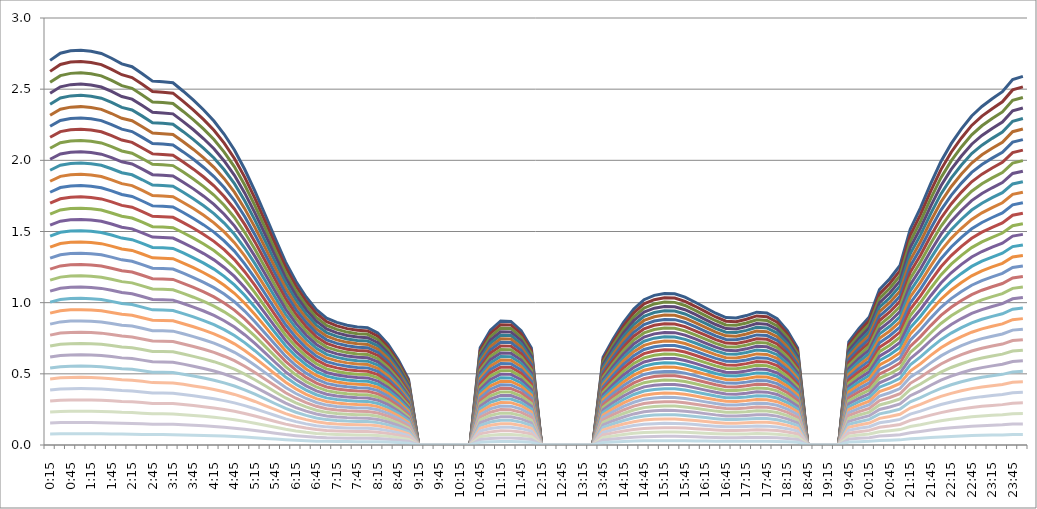
| Category | Series 0 | Series 1 | Series 2 | Series 3 | Series 4 | Series 5 | Series 6 | Series 7 | Series 8 | Series 9 | Series 10 | Series 11 | Series 12 | Series 13 | Series 14 | Series 15 | Series 16 | Series 17 | Series 18 | Series 19 | Series 20 | Series 21 | Series 22 | Series 23 | Series 24 | Series 25 | Series 26 | Series 27 | Series 28 | Series 29 | Series 30 | Series 31 | Series 32 | Series 33 | Series 34 |
|---|---|---|---|---|---|---|---|---|---|---|---|---|---|---|---|---|---|---|---|---|---|---|---|---|---|---|---|---|---|---|---|---|---|---|---|
| 0.010416666666666666 | 2.702 | 2.625 | 2.548 | 2.471 | 2.393 | 2.316 | 2.239 | 2.162 | 2.085 | 2.007 | 1.93 | 1.853 | 1.776 | 1.699 | 1.621 | 1.544 | 1.467 | 1.39 | 1.312 | 1.235 | 1.158 | 1.081 | 1.004 | 0.926 | 0.849 | 0.772 | 0.695 | 0.618 | 0.54 | 0.463 | 0.386 | 0.309 | 0.232 | 0.154 | 0.077 |
| 0.020833333333333332 | 2.752 | 2.674 | 2.595 | 2.516 | 2.438 | 2.359 | 2.28 | 2.202 | 2.123 | 2.045 | 1.966 | 1.887 | 1.809 | 1.73 | 1.651 | 1.573 | 1.494 | 1.415 | 1.337 | 1.258 | 1.18 | 1.101 | 1.022 | 0.944 | 0.865 | 0.786 | 0.708 | 0.629 | 0.55 | 0.472 | 0.393 | 0.315 | 0.236 | 0.157 | 0.079 |
| 0.03125 | 2.769 | 2.69 | 2.611 | 2.532 | 2.453 | 2.374 | 2.295 | 2.215 | 2.136 | 2.057 | 1.978 | 1.899 | 1.82 | 1.741 | 1.662 | 1.582 | 1.503 | 1.424 | 1.345 | 1.266 | 1.187 | 1.108 | 1.029 | 0.949 | 0.87 | 0.791 | 0.712 | 0.633 | 0.554 | 0.475 | 0.396 | 0.316 | 0.237 | 0.158 | 0.079 |
| 0.041666666666666664 | 2.774 | 2.694 | 2.615 | 2.536 | 2.457 | 2.377 | 2.298 | 2.219 | 2.14 | 2.06 | 1.981 | 1.902 | 1.823 | 1.743 | 1.664 | 1.585 | 1.506 | 1.426 | 1.347 | 1.268 | 1.189 | 1.109 | 1.03 | 0.951 | 0.872 | 0.792 | 0.713 | 0.634 | 0.555 | 0.475 | 0.396 | 0.317 | 0.238 | 0.158 | 0.079 |
| 0.05208333333333333 | 2.767 | 2.688 | 2.609 | 2.53 | 2.451 | 2.372 | 2.293 | 2.214 | 2.134 | 2.055 | 1.976 | 1.897 | 1.818 | 1.739 | 1.66 | 1.581 | 1.502 | 1.423 | 1.344 | 1.265 | 1.186 | 1.107 | 1.028 | 0.949 | 0.87 | 0.791 | 0.711 | 0.632 | 0.553 | 0.474 | 0.395 | 0.316 | 0.237 | 0.158 | 0.079 |
| 0.06249999999999999 | 2.751 | 2.672 | 2.594 | 2.515 | 2.436 | 2.358 | 2.279 | 2.201 | 2.122 | 2.043 | 1.965 | 1.886 | 1.808 | 1.729 | 1.65 | 1.572 | 1.493 | 1.415 | 1.336 | 1.258 | 1.179 | 1.1 | 1.022 | 0.943 | 0.865 | 0.786 | 0.707 | 0.629 | 0.55 | 0.472 | 0.393 | 0.314 | 0.236 | 0.157 | 0.079 |
| 0.07291666666666666 | 2.717 | 2.64 | 2.562 | 2.484 | 2.407 | 2.329 | 2.251 | 2.174 | 2.096 | 2.018 | 1.941 | 1.863 | 1.786 | 1.708 | 1.63 | 1.553 | 1.475 | 1.397 | 1.32 | 1.242 | 1.165 | 1.087 | 1.009 | 0.932 | 0.854 | 0.776 | 0.699 | 0.621 | 0.543 | 0.466 | 0.388 | 0.311 | 0.233 | 0.155 | 0.078 |
| 0.08333333333333333 | 2.678 | 2.602 | 2.525 | 2.449 | 2.372 | 2.295 | 2.219 | 2.142 | 2.066 | 1.989 | 1.913 | 1.836 | 1.76 | 1.683 | 1.607 | 1.53 | 1.454 | 1.377 | 1.301 | 1.224 | 1.148 | 1.071 | 0.995 | 0.918 | 0.842 | 0.765 | 0.689 | 0.612 | 0.536 | 0.459 | 0.383 | 0.306 | 0.23 | 0.153 | 0.077 |
| 0.09375 | 2.658 | 2.582 | 2.506 | 2.43 | 2.354 | 2.278 | 2.202 | 2.126 | 2.05 | 1.974 | 1.898 | 1.822 | 1.747 | 1.671 | 1.595 | 1.519 | 1.443 | 1.367 | 1.291 | 1.215 | 1.139 | 1.063 | 0.987 | 0.911 | 0.835 | 0.759 | 0.683 | 0.607 | 0.532 | 0.456 | 0.38 | 0.304 | 0.228 | 0.152 | 0.076 |
| 0.10416666666666667 | 2.609 | 2.534 | 2.46 | 2.385 | 2.311 | 2.236 | 2.162 | 2.087 | 2.012 | 1.938 | 1.863 | 1.789 | 1.714 | 1.64 | 1.565 | 1.491 | 1.416 | 1.342 | 1.267 | 1.193 | 1.118 | 1.044 | 0.969 | 0.894 | 0.82 | 0.745 | 0.671 | 0.596 | 0.522 | 0.447 | 0.373 | 0.298 | 0.224 | 0.149 | 0.075 |
| 0.11458333333333334 | 2.557 | 2.484 | 2.41 | 2.337 | 2.264 | 2.191 | 2.118 | 2.045 | 1.972 | 1.899 | 1.826 | 1.753 | 1.68 | 1.607 | 1.534 | 1.461 | 1.388 | 1.315 | 1.242 | 1.169 | 1.096 | 1.023 | 0.95 | 0.877 | 0.803 | 0.73 | 0.657 | 0.584 | 0.511 | 0.438 | 0.365 | 0.292 | 0.219 | 0.146 | 0.073 |
| 0.125 | 2.551 | 2.478 | 2.406 | 2.333 | 2.26 | 2.187 | 2.114 | 2.041 | 1.968 | 1.895 | 1.822 | 1.749 | 1.677 | 1.604 | 1.531 | 1.458 | 1.385 | 1.312 | 1.239 | 1.166 | 1.093 | 1.021 | 0.948 | 0.875 | 0.802 | 0.729 | 0.656 | 0.583 | 0.51 | 0.437 | 0.364 | 0.292 | 0.219 | 0.146 | 0.073 |
| 0.13541666666666666 | 2.545 | 2.472 | 2.399 | 2.327 | 2.254 | 2.181 | 2.108 | 2.036 | 1.963 | 1.89 | 1.818 | 1.745 | 1.672 | 1.599 | 1.527 | 1.454 | 1.381 | 1.309 | 1.236 | 1.163 | 1.091 | 1.018 | 0.945 | 0.872 | 0.8 | 0.727 | 0.654 | 0.582 | 0.509 | 0.436 | 0.364 | 0.291 | 0.218 | 0.145 | 0.073 |
| 0.14583333333333331 | 2.485 | 2.414 | 2.343 | 2.272 | 2.201 | 2.13 | 2.059 | 1.988 | 1.917 | 1.846 | 1.775 | 1.704 | 1.633 | 1.562 | 1.491 | 1.42 | 1.349 | 1.278 | 1.207 | 1.136 | 1.065 | 0.994 | 0.923 | 0.852 | 0.781 | 0.71 | 0.639 | 0.568 | 0.497 | 0.426 | 0.355 | 0.284 | 0.213 | 0.142 | 0.071 |
| 0.15624999999999997 | 2.422 | 2.353 | 2.284 | 2.215 | 2.146 | 2.076 | 2.007 | 1.938 | 1.869 | 1.8 | 1.73 | 1.661 | 1.592 | 1.523 | 1.453 | 1.384 | 1.315 | 1.246 | 1.177 | 1.107 | 1.038 | 0.969 | 0.9 | 0.831 | 0.761 | 0.692 | 0.623 | 0.554 | 0.484 | 0.415 | 0.346 | 0.277 | 0.208 | 0.138 | 0.069 |
| 0.16666666666666663 | 2.353 | 2.286 | 2.219 | 2.152 | 2.084 | 2.017 | 1.95 | 1.883 | 1.815 | 1.748 | 1.681 | 1.614 | 1.546 | 1.479 | 1.412 | 1.345 | 1.278 | 1.21 | 1.143 | 1.076 | 1.009 | 0.941 | 0.874 | 0.807 | 0.74 | 0.672 | 0.605 | 0.538 | 0.471 | 0.403 | 0.336 | 0.269 | 0.202 | 0.134 | 0.067 |
| 0.1770833333333333 | 2.276 | 2.211 | 2.146 | 2.081 | 2.016 | 1.951 | 1.886 | 1.821 | 1.756 | 1.691 | 1.626 | 1.561 | 1.496 | 1.431 | 1.366 | 1.301 | 1.236 | 1.171 | 1.106 | 1.041 | 0.976 | 0.911 | 0.846 | 0.78 | 0.715 | 0.65 | 0.585 | 0.52 | 0.455 | 0.39 | 0.325 | 0.26 | 0.195 | 0.13 | 0.065 |
| 0.18749999999999994 | 2.183 | 2.121 | 2.058 | 1.996 | 1.933 | 1.871 | 1.809 | 1.746 | 1.684 | 1.622 | 1.559 | 1.497 | 1.434 | 1.372 | 1.31 | 1.247 | 1.185 | 1.123 | 1.06 | 0.998 | 0.936 | 0.873 | 0.811 | 0.748 | 0.686 | 0.624 | 0.561 | 0.499 | 0.437 | 0.374 | 0.312 | 0.249 | 0.187 | 0.125 | 0.062 |
| 0.1979166666666666 | 2.073 | 2.014 | 1.954 | 1.895 | 1.836 | 1.777 | 1.717 | 1.658 | 1.599 | 1.54 | 1.481 | 1.421 | 1.362 | 1.303 | 1.244 | 1.184 | 1.125 | 1.066 | 1.007 | 0.948 | 0.888 | 0.829 | 0.77 | 0.711 | 0.651 | 0.592 | 0.533 | 0.474 | 0.415 | 0.355 | 0.296 | 0.237 | 0.178 | 0.118 | 0.059 |
| 0.20833333333333326 | 1.937 | 1.882 | 1.827 | 1.771 | 1.716 | 1.661 | 1.605 | 1.55 | 1.495 | 1.439 | 1.384 | 1.328 | 1.273 | 1.218 | 1.162 | 1.107 | 1.052 | 0.996 | 0.941 | 0.886 | 0.83 | 0.775 | 0.72 | 0.664 | 0.609 | 0.554 | 0.498 | 0.443 | 0.387 | 0.332 | 0.277 | 0.221 | 0.166 | 0.111 | 0.055 |
| 0.21874999999999992 | 1.784 | 1.733 | 1.682 | 1.631 | 1.58 | 1.529 | 1.478 | 1.427 | 1.376 | 1.325 | 1.274 | 1.223 | 1.172 | 1.121 | 1.07 | 1.019 | 0.968 | 0.917 | 0.866 | 0.815 | 0.764 | 0.713 | 0.663 | 0.612 | 0.561 | 0.51 | 0.459 | 0.408 | 0.357 | 0.306 | 0.255 | 0.204 | 0.153 | 0.102 | 0.051 |
| 0.22916666666666657 | 1.618 | 1.571 | 1.525 | 1.479 | 1.433 | 1.386 | 1.34 | 1.294 | 1.248 | 1.202 | 1.155 | 1.109 | 1.063 | 1.017 | 0.971 | 0.924 | 0.878 | 0.832 | 0.786 | 0.739 | 0.693 | 0.647 | 0.601 | 0.555 | 0.508 | 0.462 | 0.416 | 0.37 | 0.324 | 0.277 | 0.231 | 0.185 | 0.139 | 0.092 | 0.046 |
| 0.23958333333333323 | 1.449 | 1.408 | 1.366 | 1.325 | 1.283 | 1.242 | 1.201 | 1.159 | 1.118 | 1.076 | 1.035 | 0.994 | 0.952 | 0.911 | 0.869 | 0.828 | 0.787 | 0.745 | 0.704 | 0.662 | 0.621 | 0.58 | 0.538 | 0.497 | 0.455 | 0.414 | 0.373 | 0.331 | 0.29 | 0.248 | 0.207 | 0.166 | 0.124 | 0.083 | 0.041 |
| 0.2499999999999999 | 1.285 | 1.248 | 1.212 | 1.175 | 1.138 | 1.101 | 1.065 | 1.028 | 0.991 | 0.955 | 0.918 | 0.881 | 0.844 | 0.808 | 0.771 | 0.734 | 0.698 | 0.661 | 0.624 | 0.587 | 0.551 | 0.514 | 0.477 | 0.441 | 0.404 | 0.367 | 0.33 | 0.294 | 0.257 | 0.22 | 0.184 | 0.147 | 0.11 | 0.073 | 0.037 |
| 0.2604166666666666 | 1.15 | 1.117 | 1.084 | 1.052 | 1.019 | 0.986 | 0.953 | 0.92 | 0.887 | 0.854 | 0.822 | 0.789 | 0.756 | 0.723 | 0.69 | 0.657 | 0.624 | 0.592 | 0.559 | 0.526 | 0.493 | 0.46 | 0.427 | 0.394 | 0.361 | 0.329 | 0.296 | 0.263 | 0.23 | 0.197 | 0.164 | 0.131 | 0.099 | 0.066 | 0.033 |
| 0.27083333333333326 | 1.04 | 1.01 | 0.98 | 0.95 | 0.921 | 0.891 | 0.861 | 0.832 | 0.802 | 0.772 | 0.743 | 0.713 | 0.683 | 0.653 | 0.624 | 0.594 | 0.564 | 0.535 | 0.505 | 0.475 | 0.446 | 0.416 | 0.386 | 0.356 | 0.327 | 0.297 | 0.267 | 0.238 | 0.208 | 0.178 | 0.149 | 0.119 | 0.089 | 0.059 | 0.03 |
| 0.28124999999999994 | 0.951 | 0.924 | 0.897 | 0.869 | 0.842 | 0.815 | 0.788 | 0.761 | 0.734 | 0.706 | 0.679 | 0.652 | 0.625 | 0.598 | 0.571 | 0.543 | 0.516 | 0.489 | 0.462 | 0.435 | 0.408 | 0.38 | 0.353 | 0.326 | 0.299 | 0.272 | 0.245 | 0.217 | 0.19 | 0.163 | 0.136 | 0.109 | 0.082 | 0.054 | 0.027 |
| 0.29166666666666663 | 0.892 | 0.866 | 0.841 | 0.815 | 0.79 | 0.764 | 0.739 | 0.713 | 0.688 | 0.662 | 0.637 | 0.611 | 0.586 | 0.561 | 0.535 | 0.51 | 0.484 | 0.459 | 0.433 | 0.408 | 0.382 | 0.357 | 0.331 | 0.306 | 0.28 | 0.255 | 0.229 | 0.204 | 0.178 | 0.153 | 0.127 | 0.102 | 0.076 | 0.051 | 0.025 |
| 0.3020833333333333 | 0.862 | 0.837 | 0.813 | 0.788 | 0.763 | 0.739 | 0.714 | 0.689 | 0.665 | 0.64 | 0.616 | 0.591 | 0.566 | 0.542 | 0.517 | 0.492 | 0.468 | 0.443 | 0.419 | 0.394 | 0.369 | 0.345 | 0.32 | 0.295 | 0.271 | 0.246 | 0.222 | 0.197 | 0.172 | 0.148 | 0.123 | 0.098 | 0.074 | 0.049 | 0.025 |
| 0.3125 | 0.841 | 0.817 | 0.793 | 0.769 | 0.745 | 0.721 | 0.697 | 0.673 | 0.649 | 0.625 | 0.601 | 0.577 | 0.553 | 0.529 | 0.505 | 0.481 | 0.457 | 0.433 | 0.409 | 0.385 | 0.361 | 0.337 | 0.313 | 0.289 | 0.264 | 0.24 | 0.216 | 0.192 | 0.168 | 0.144 | 0.12 | 0.096 | 0.072 | 0.048 | 0.024 |
| 0.3229166666666667 | 0.83 | 0.806 | 0.782 | 0.758 | 0.735 | 0.711 | 0.687 | 0.664 | 0.64 | 0.616 | 0.593 | 0.569 | 0.545 | 0.521 | 0.498 | 0.474 | 0.45 | 0.427 | 0.403 | 0.379 | 0.356 | 0.332 | 0.308 | 0.284 | 0.261 | 0.237 | 0.213 | 0.19 | 0.166 | 0.142 | 0.119 | 0.095 | 0.071 | 0.047 | 0.024 |
| 0.33333333333333337 | 0.825 | 0.801 | 0.778 | 0.754 | 0.73 | 0.707 | 0.683 | 0.66 | 0.636 | 0.613 | 0.589 | 0.565 | 0.542 | 0.518 | 0.495 | 0.471 | 0.448 | 0.424 | 0.401 | 0.377 | 0.353 | 0.33 | 0.306 | 0.283 | 0.259 | 0.236 | 0.212 | 0.188 | 0.165 | 0.141 | 0.118 | 0.094 | 0.071 | 0.047 | 0.024 |
| 0.34375000000000006 | 0.786 | 0.764 | 0.741 | 0.719 | 0.697 | 0.674 | 0.652 | 0.629 | 0.607 | 0.584 | 0.562 | 0.539 | 0.517 | 0.494 | 0.472 | 0.449 | 0.427 | 0.404 | 0.382 | 0.359 | 0.337 | 0.315 | 0.292 | 0.27 | 0.247 | 0.225 | 0.202 | 0.18 | 0.157 | 0.135 | 0.112 | 0.09 | 0.067 | 0.045 | 0.022 |
| 0.35416666666666674 | 0.708 | 0.688 | 0.668 | 0.647 | 0.627 | 0.607 | 0.587 | 0.566 | 0.546 | 0.526 | 0.506 | 0.486 | 0.465 | 0.445 | 0.425 | 0.405 | 0.384 | 0.364 | 0.344 | 0.324 | 0.303 | 0.283 | 0.263 | 0.243 | 0.223 | 0.202 | 0.182 | 0.162 | 0.142 | 0.121 | 0.101 | 0.081 | 0.061 | 0.04 | 0.02 |
| 0.3645833333333334 | 0.599 | 0.582 | 0.565 | 0.548 | 0.53 | 0.513 | 0.496 | 0.479 | 0.462 | 0.445 | 0.428 | 0.411 | 0.394 | 0.376 | 0.359 | 0.342 | 0.325 | 0.308 | 0.291 | 0.274 | 0.257 | 0.24 | 0.222 | 0.205 | 0.188 | 0.171 | 0.154 | 0.137 | 0.12 | 0.103 | 0.086 | 0.068 | 0.051 | 0.034 | 0.017 |
| 0.3750000000000001 | 0.462 | 0.449 | 0.436 | 0.423 | 0.409 | 0.396 | 0.383 | 0.37 | 0.357 | 0.343 | 0.33 | 0.317 | 0.304 | 0.291 | 0.277 | 0.264 | 0.251 | 0.238 | 0.225 | 0.211 | 0.198 | 0.185 | 0.172 | 0.159 | 0.145 | 0.132 | 0.119 | 0.106 | 0.092 | 0.079 | 0.066 | 0.053 | 0.04 | 0.026 | 0.013 |
| 0.3854166666666668 | 0 | 0 | 0 | 0 | 0 | 0 | 0 | 0 | 0 | 0 | 0 | 0 | 0 | 0 | 0 | 0 | 0 | 0 | 0 | 0 | 0 | 0 | 0 | 0 | 0 | 0 | 0 | 0 | 0 | 0 | 0 | 0 | 0 | 0 | 0 |
| 0.3958333333333335 | 0 | 0 | 0 | 0 | 0 | 0 | 0 | 0 | 0 | 0 | 0 | 0 | 0 | 0 | 0 | 0 | 0 | 0 | 0 | 0 | 0 | 0 | 0 | 0 | 0 | 0 | 0 | 0 | 0 | 0 | 0 | 0 | 0 | 0 | 0 |
| 0.40625000000000017 | 0 | 0 | 0 | 0 | 0 | 0 | 0 | 0 | 0 | 0 | 0 | 0 | 0 | 0 | 0 | 0 | 0 | 0 | 0 | 0 | 0 | 0 | 0 | 0 | 0 | 0 | 0 | 0 | 0 | 0 | 0 | 0 | 0 | 0 | 0 |
| 0.41666666666666685 | 0 | 0 | 0 | 0 | 0 | 0 | 0 | 0 | 0 | 0 | 0 | 0 | 0 | 0 | 0 | 0 | 0 | 0 | 0 | 0 | 0 | 0 | 0 | 0 | 0 | 0 | 0 | 0 | 0 | 0 | 0 | 0 | 0 | 0 | 0 |
| 0.42708333333333354 | 0 | 0 | 0 | 0 | 0 | 0 | 0 | 0 | 0 | 0 | 0 | 0 | 0 | 0 | 0 | 0 | 0 | 0 | 0 | 0 | 0 | 0 | 0 | 0 | 0 | 0 | 0 | 0 | 0 | 0 | 0 | 0 | 0 | 0 | 0 |
| 0.4375000000000002 | 0 | 0 | 0 | 0 | 0 | 0 | 0 | 0 | 0 | 0 | 0 | 0 | 0 | 0 | 0 | 0 | 0 | 0 | 0 | 0 | 0 | 0 | 0 | 0 | 0 | 0 | 0 | 0 | 0 | 0 | 0 | 0 | 0 | 0 | 0 |
| 0.4479166666666669 | 0.683 | 0.664 | 0.644 | 0.625 | 0.605 | 0.585 | 0.566 | 0.546 | 0.527 | 0.507 | 0.488 | 0.468 | 0.449 | 0.429 | 0.41 | 0.39 | 0.371 | 0.351 | 0.332 | 0.312 | 0.293 | 0.273 | 0.254 | 0.234 | 0.215 | 0.195 | 0.176 | 0.156 | 0.137 | 0.117 | 0.098 | 0.078 | 0.059 | 0.039 | 0.02 |
| 0.4583333333333336 | 0.807 | 0.784 | 0.761 | 0.738 | 0.715 | 0.692 | 0.669 | 0.646 | 0.623 | 0.6 | 0.576 | 0.553 | 0.53 | 0.507 | 0.484 | 0.461 | 0.438 | 0.415 | 0.392 | 0.369 | 0.346 | 0.323 | 0.3 | 0.277 | 0.254 | 0.231 | 0.208 | 0.184 | 0.161 | 0.138 | 0.115 | 0.092 | 0.069 | 0.046 | 0.023 |
| 0.4687500000000003 | 0.87 | 0.845 | 0.821 | 0.796 | 0.771 | 0.746 | 0.721 | 0.696 | 0.671 | 0.646 | 0.622 | 0.597 | 0.572 | 0.547 | 0.522 | 0.497 | 0.472 | 0.448 | 0.423 | 0.398 | 0.373 | 0.348 | 0.323 | 0.298 | 0.274 | 0.249 | 0.224 | 0.199 | 0.174 | 0.149 | 0.124 | 0.099 | 0.075 | 0.05 | 0.025 |
| 0.47916666666666696 | 0.868 | 0.844 | 0.819 | 0.794 | 0.769 | 0.744 | 0.719 | 0.695 | 0.67 | 0.645 | 0.62 | 0.595 | 0.571 | 0.546 | 0.521 | 0.496 | 0.471 | 0.447 | 0.422 | 0.397 | 0.372 | 0.347 | 0.323 | 0.298 | 0.273 | 0.248 | 0.223 | 0.198 | 0.174 | 0.149 | 0.124 | 0.099 | 0.074 | 0.05 | 0.025 |
| 0.48958333333333365 | 0.804 | 0.781 | 0.758 | 0.735 | 0.712 | 0.689 | 0.666 | 0.643 | 0.62 | 0.597 | 0.574 | 0.551 | 0.528 | 0.505 | 0.482 | 0.459 | 0.436 | 0.413 | 0.39 | 0.367 | 0.344 | 0.321 | 0.298 | 0.275 | 0.253 | 0.23 | 0.207 | 0.184 | 0.161 | 0.138 | 0.115 | 0.092 | 0.069 | 0.046 | 0.023 |
| 0.5000000000000003 | 0.682 | 0.662 | 0.643 | 0.623 | 0.604 | 0.584 | 0.565 | 0.545 | 0.526 | 0.506 | 0.487 | 0.467 | 0.448 | 0.429 | 0.409 | 0.39 | 0.37 | 0.351 | 0.331 | 0.312 | 0.292 | 0.273 | 0.253 | 0.234 | 0.214 | 0.195 | 0.175 | 0.156 | 0.136 | 0.117 | 0.097 | 0.078 | 0.058 | 0.039 | 0.019 |
| 0.510416666666667 | 0 | 0 | 0 | 0 | 0 | 0 | 0 | 0 | 0 | 0 | 0 | 0 | 0 | 0 | 0 | 0 | 0 | 0 | 0 | 0 | 0 | 0 | 0 | 0 | 0 | 0 | 0 | 0 | 0 | 0 | 0 | 0 | 0 | 0 | 0 |
| 0.5208333333333336 | 0 | 0 | 0 | 0 | 0 | 0 | 0 | 0 | 0 | 0 | 0 | 0 | 0 | 0 | 0 | 0 | 0 | 0 | 0 | 0 | 0 | 0 | 0 | 0 | 0 | 0 | 0 | 0 | 0 | 0 | 0 | 0 | 0 | 0 | 0 |
| 0.5312500000000002 | 0 | 0 | 0 | 0 | 0 | 0 | 0 | 0 | 0 | 0 | 0 | 0 | 0 | 0 | 0 | 0 | 0 | 0 | 0 | 0 | 0 | 0 | 0 | 0 | 0 | 0 | 0 | 0 | 0 | 0 | 0 | 0 | 0 | 0 | 0 |
| 0.5416666666666669 | 0 | 0 | 0 | 0 | 0 | 0 | 0 | 0 | 0 | 0 | 0 | 0 | 0 | 0 | 0 | 0 | 0 | 0 | 0 | 0 | 0 | 0 | 0 | 0 | 0 | 0 | 0 | 0 | 0 | 0 | 0 | 0 | 0 | 0 | 0 |
| 0.5520833333333335 | 0 | 0 | 0 | 0 | 0 | 0 | 0 | 0 | 0 | 0 | 0 | 0 | 0 | 0 | 0 | 0 | 0 | 0 | 0 | 0 | 0 | 0 | 0 | 0 | 0 | 0 | 0 | 0 | 0 | 0 | 0 | 0 | 0 | 0 | 0 |
| 0.5625000000000001 | 0 | 0 | 0 | 0 | 0 | 0 | 0 | 0 | 0 | 0 | 0 | 0 | 0 | 0 | 0 | 0 | 0 | 0 | 0 | 0 | 0 | 0 | 0 | 0 | 0 | 0 | 0 | 0 | 0 | 0 | 0 | 0 | 0 | 0 | 0 |
| 0.5729166666666667 | 0.617 | 0.6 | 0.582 | 0.564 | 0.547 | 0.529 | 0.511 | 0.494 | 0.476 | 0.459 | 0.441 | 0.423 | 0.406 | 0.388 | 0.37 | 0.353 | 0.335 | 0.317 | 0.3 | 0.282 | 0.265 | 0.247 | 0.229 | 0.212 | 0.194 | 0.176 | 0.159 | 0.141 | 0.123 | 0.106 | 0.088 | 0.071 | 0.053 | 0.035 | 0.018 |
| 0.5833333333333334 | 0.746 | 0.725 | 0.703 | 0.682 | 0.661 | 0.639 | 0.618 | 0.597 | 0.575 | 0.554 | 0.533 | 0.512 | 0.49 | 0.469 | 0.448 | 0.426 | 0.405 | 0.384 | 0.362 | 0.341 | 0.32 | 0.298 | 0.277 | 0.256 | 0.234 | 0.213 | 0.192 | 0.171 | 0.149 | 0.128 | 0.107 | 0.085 | 0.064 | 0.043 | 0.021 |
| 0.59375 | 0.861 | 0.837 | 0.812 | 0.787 | 0.763 | 0.738 | 0.714 | 0.689 | 0.664 | 0.64 | 0.615 | 0.591 | 0.566 | 0.541 | 0.517 | 0.492 | 0.468 | 0.443 | 0.418 | 0.394 | 0.369 | 0.345 | 0.32 | 0.295 | 0.271 | 0.246 | 0.221 | 0.197 | 0.172 | 0.148 | 0.123 | 0.098 | 0.074 | 0.049 | 0.025 |
| 0.6041666666666666 | 0.955 | 0.928 | 0.901 | 0.873 | 0.846 | 0.819 | 0.792 | 0.764 | 0.737 | 0.71 | 0.682 | 0.655 | 0.628 | 0.601 | 0.573 | 0.546 | 0.519 | 0.491 | 0.464 | 0.437 | 0.409 | 0.382 | 0.355 | 0.328 | 0.3 | 0.273 | 0.246 | 0.218 | 0.191 | 0.164 | 0.136 | 0.109 | 0.082 | 0.055 | 0.027 |
| 0.6145833333333333 | 1.021 | 0.992 | 0.963 | 0.933 | 0.904 | 0.875 | 0.846 | 0.817 | 0.788 | 0.758 | 0.729 | 0.7 | 0.671 | 0.642 | 0.613 | 0.583 | 0.554 | 0.525 | 0.496 | 0.467 | 0.438 | 0.408 | 0.379 | 0.35 | 0.321 | 0.292 | 0.263 | 0.233 | 0.204 | 0.175 | 0.146 | 0.117 | 0.088 | 0.058 | 0.029 |
| 0.6249999999999999 | 1.051 | 1.021 | 0.991 | 0.961 | 0.931 | 0.901 | 0.871 | 0.841 | 0.811 | 0.781 | 0.751 | 0.721 | 0.691 | 0.661 | 0.631 | 0.601 | 0.571 | 0.541 | 0.511 | 0.48 | 0.45 | 0.42 | 0.39 | 0.36 | 0.33 | 0.3 | 0.27 | 0.24 | 0.21 | 0.18 | 0.15 | 0.12 | 0.09 | 0.06 | 0.03 |
| 0.6354166666666665 | 1.065 | 1.034 | 1.004 | 0.973 | 0.943 | 0.913 | 0.882 | 0.852 | 0.821 | 0.791 | 0.761 | 0.73 | 0.7 | 0.669 | 0.639 | 0.608 | 0.578 | 0.548 | 0.517 | 0.487 | 0.456 | 0.426 | 0.395 | 0.365 | 0.335 | 0.304 | 0.274 | 0.243 | 0.213 | 0.183 | 0.152 | 0.122 | 0.091 | 0.061 | 0.03 |
| 0.6458333333333331 | 1.063 | 1.032 | 1.002 | 0.972 | 0.941 | 0.911 | 0.881 | 0.85 | 0.82 | 0.79 | 0.759 | 0.729 | 0.698 | 0.668 | 0.638 | 0.607 | 0.577 | 0.547 | 0.516 | 0.486 | 0.455 | 0.425 | 0.395 | 0.364 | 0.334 | 0.304 | 0.273 | 0.243 | 0.213 | 0.182 | 0.152 | 0.121 | 0.091 | 0.061 | 0.03 |
| 0.6562499999999998 | 1.039 | 1.01 | 0.98 | 0.95 | 0.921 | 0.891 | 0.861 | 0.832 | 0.802 | 0.772 | 0.742 | 0.713 | 0.683 | 0.653 | 0.624 | 0.594 | 0.564 | 0.535 | 0.505 | 0.475 | 0.445 | 0.416 | 0.386 | 0.356 | 0.327 | 0.297 | 0.267 | 0.238 | 0.208 | 0.178 | 0.148 | 0.119 | 0.089 | 0.059 | 0.03 |
| 0.6666666666666664 | 1.003 | 0.975 | 0.946 | 0.917 | 0.889 | 0.86 | 0.831 | 0.803 | 0.774 | 0.745 | 0.717 | 0.688 | 0.659 | 0.631 | 0.602 | 0.573 | 0.545 | 0.516 | 0.487 | 0.459 | 0.43 | 0.401 | 0.373 | 0.344 | 0.315 | 0.287 | 0.258 | 0.229 | 0.201 | 0.172 | 0.143 | 0.115 | 0.086 | 0.057 | 0.029 |
| 0.677083333333333 | 0.964 | 0.937 | 0.909 | 0.881 | 0.854 | 0.826 | 0.799 | 0.771 | 0.744 | 0.716 | 0.689 | 0.661 | 0.634 | 0.606 | 0.578 | 0.551 | 0.523 | 0.496 | 0.468 | 0.441 | 0.413 | 0.386 | 0.358 | 0.331 | 0.303 | 0.275 | 0.248 | 0.22 | 0.193 | 0.165 | 0.138 | 0.11 | 0.083 | 0.055 | 0.028 |
| 0.6874999999999997 | 0.926 | 0.899 | 0.873 | 0.847 | 0.82 | 0.794 | 0.767 | 0.741 | 0.714 | 0.688 | 0.661 | 0.635 | 0.608 | 0.582 | 0.556 | 0.529 | 0.503 | 0.476 | 0.45 | 0.423 | 0.397 | 0.37 | 0.344 | 0.317 | 0.291 | 0.265 | 0.238 | 0.212 | 0.185 | 0.159 | 0.132 | 0.106 | 0.079 | 0.053 | 0.026 |
| 0.6979166666666663 | 0.895 | 0.869 | 0.844 | 0.818 | 0.793 | 0.767 | 0.742 | 0.716 | 0.69 | 0.665 | 0.639 | 0.614 | 0.588 | 0.563 | 0.537 | 0.511 | 0.486 | 0.46 | 0.435 | 0.409 | 0.384 | 0.358 | 0.332 | 0.307 | 0.281 | 0.256 | 0.23 | 0.205 | 0.179 | 0.153 | 0.128 | 0.102 | 0.077 | 0.051 | 0.026 |
| 0.7083333333333329 | 0.892 | 0.866 | 0.841 | 0.816 | 0.79 | 0.765 | 0.739 | 0.714 | 0.688 | 0.663 | 0.637 | 0.612 | 0.586 | 0.561 | 0.535 | 0.51 | 0.484 | 0.459 | 0.433 | 0.408 | 0.382 | 0.357 | 0.331 | 0.306 | 0.28 | 0.255 | 0.229 | 0.204 | 0.178 | 0.153 | 0.127 | 0.102 | 0.076 | 0.051 | 0.025 |
| 0.7187499999999996 | 0.909 | 0.883 | 0.857 | 0.831 | 0.805 | 0.779 | 0.753 | 0.728 | 0.702 | 0.676 | 0.65 | 0.624 | 0.598 | 0.572 | 0.546 | 0.52 | 0.494 | 0.468 | 0.442 | 0.416 | 0.39 | 0.364 | 0.338 | 0.312 | 0.286 | 0.26 | 0.234 | 0.208 | 0.182 | 0.156 | 0.13 | 0.104 | 0.078 | 0.052 | 0.026 |
| 0.7291666666666662 | 0.933 | 0.907 | 0.88 | 0.853 | 0.827 | 0.8 | 0.773 | 0.747 | 0.72 | 0.693 | 0.667 | 0.64 | 0.613 | 0.587 | 0.56 | 0.533 | 0.507 | 0.48 | 0.453 | 0.427 | 0.4 | 0.373 | 0.347 | 0.32 | 0.293 | 0.267 | 0.24 | 0.213 | 0.187 | 0.16 | 0.133 | 0.107 | 0.08 | 0.053 | 0.027 |
| 0.7395833333333328 | 0.928 | 0.902 | 0.875 | 0.849 | 0.822 | 0.796 | 0.769 | 0.743 | 0.716 | 0.69 | 0.663 | 0.636 | 0.61 | 0.583 | 0.557 | 0.53 | 0.504 | 0.477 | 0.451 | 0.424 | 0.398 | 0.371 | 0.345 | 0.318 | 0.292 | 0.265 | 0.239 | 0.212 | 0.186 | 0.159 | 0.133 | 0.106 | 0.08 | 0.053 | 0.027 |
| 0.7499999999999994 | 0.888 | 0.863 | 0.837 | 0.812 | 0.786 | 0.761 | 0.736 | 0.71 | 0.685 | 0.66 | 0.634 | 0.609 | 0.583 | 0.558 | 0.533 | 0.507 | 0.482 | 0.457 | 0.431 | 0.406 | 0.381 | 0.355 | 0.33 | 0.304 | 0.279 | 0.254 | 0.228 | 0.203 | 0.178 | 0.152 | 0.127 | 0.101 | 0.076 | 0.051 | 0.025 |
| 0.7604166666666661 | 0.804 | 0.781 | 0.758 | 0.735 | 0.712 | 0.689 | 0.666 | 0.643 | 0.62 | 0.597 | 0.574 | 0.551 | 0.528 | 0.505 | 0.482 | 0.459 | 0.436 | 0.413 | 0.39 | 0.367 | 0.344 | 0.321 | 0.298 | 0.275 | 0.253 | 0.23 | 0.207 | 0.184 | 0.161 | 0.138 | 0.115 | 0.092 | 0.069 | 0.046 | 0.023 |
| 0.7708333333333327 | 0.682 | 0.662 | 0.643 | 0.623 | 0.604 | 0.584 | 0.565 | 0.545 | 0.526 | 0.506 | 0.487 | 0.467 | 0.448 | 0.429 | 0.409 | 0.39 | 0.37 | 0.351 | 0.331 | 0.312 | 0.292 | 0.273 | 0.253 | 0.234 | 0.214 | 0.195 | 0.175 | 0.156 | 0.136 | 0.117 | 0.097 | 0.078 | 0.058 | 0.039 | 0.019 |
| 0.7812499999999993 | 0 | 0 | 0 | 0 | 0 | 0 | 0 | 0 | 0 | 0 | 0 | 0 | 0 | 0 | 0 | 0 | 0 | 0 | 0 | 0 | 0 | 0 | 0 | 0 | 0 | 0 | 0 | 0 | 0 | 0 | 0 | 0 | 0 | 0 | 0 |
| 0.791666666666666 | 0 | 0 | 0 | 0 | 0 | 0 | 0 | 0 | 0 | 0 | 0 | 0 | 0 | 0 | 0 | 0 | 0 | 0 | 0 | 0 | 0 | 0 | 0 | 0 | 0 | 0 | 0 | 0 | 0 | 0 | 0 | 0 | 0 | 0 | 0 |
| 0.8020833333333326 | 0 | 0 | 0 | 0 | 0 | 0 | 0 | 0 | 0 | 0 | 0 | 0 | 0 | 0 | 0 | 0 | 0 | 0 | 0 | 0 | 0 | 0 | 0 | 0 | 0 | 0 | 0 | 0 | 0 | 0 | 0 | 0 | 0 | 0 | 0 |
| 0.8124999999999992 | 0 | 0 | 0 | 0 | 0 | 0 | 0 | 0 | 0 | 0 | 0 | 0 | 0 | 0 | 0 | 0 | 0 | 0 | 0 | 0 | 0 | 0 | 0 | 0 | 0 | 0 | 0 | 0 | 0 | 0 | 0 | 0 | 0 | 0 | 0 |
| 0.8229166666666659 | 0.725 | 0.704 | 0.684 | 0.663 | 0.642 | 0.621 | 0.601 | 0.58 | 0.559 | 0.539 | 0.518 | 0.497 | 0.476 | 0.456 | 0.435 | 0.414 | 0.394 | 0.373 | 0.352 | 0.331 | 0.311 | 0.29 | 0.269 | 0.249 | 0.228 | 0.207 | 0.186 | 0.166 | 0.145 | 0.124 | 0.104 | 0.083 | 0.062 | 0.041 | 0.021 |
| 0.8333333333333325 | 0.819 | 0.796 | 0.772 | 0.749 | 0.725 | 0.702 | 0.679 | 0.655 | 0.632 | 0.608 | 0.585 | 0.562 | 0.538 | 0.515 | 0.491 | 0.468 | 0.445 | 0.421 | 0.398 | 0.374 | 0.351 | 0.328 | 0.304 | 0.281 | 0.257 | 0.234 | 0.211 | 0.187 | 0.164 | 0.14 | 0.117 | 0.094 | 0.07 | 0.047 | 0.023 |
| 0.8437499999999991 | 0.9 | 0.874 | 0.848 | 0.823 | 0.797 | 0.771 | 0.746 | 0.72 | 0.694 | 0.668 | 0.643 | 0.617 | 0.591 | 0.566 | 0.54 | 0.514 | 0.488 | 0.463 | 0.437 | 0.411 | 0.386 | 0.36 | 0.334 | 0.308 | 0.283 | 0.257 | 0.231 | 0.206 | 0.18 | 0.154 | 0.129 | 0.103 | 0.077 | 0.051 | 0.026 |
| 0.8541666666666657 | 1.093 | 1.062 | 1.03 | 0.999 | 0.968 | 0.937 | 0.906 | 0.874 | 0.843 | 0.812 | 0.781 | 0.749 | 0.718 | 0.687 | 0.656 | 0.625 | 0.593 | 0.562 | 0.531 | 0.5 | 0.468 | 0.437 | 0.406 | 0.375 | 0.343 | 0.312 | 0.281 | 0.25 | 0.219 | 0.187 | 0.156 | 0.125 | 0.094 | 0.062 | 0.031 |
| 0.8645833333333324 | 1.168 | 1.135 | 1.101 | 1.068 | 1.035 | 1.001 | 0.968 | 0.935 | 0.901 | 0.868 | 0.834 | 0.801 | 0.768 | 0.734 | 0.701 | 0.668 | 0.634 | 0.601 | 0.567 | 0.534 | 0.501 | 0.467 | 0.434 | 0.401 | 0.367 | 0.334 | 0.3 | 0.267 | 0.234 | 0.2 | 0.167 | 0.134 | 0.1 | 0.067 | 0.033 |
| 0.874999999999999 | 1.261 | 1.225 | 1.189 | 1.153 | 1.117 | 1.081 | 1.045 | 1.009 | 0.973 | 0.937 | 0.901 | 0.865 | 0.829 | 0.793 | 0.757 | 0.721 | 0.685 | 0.649 | 0.613 | 0.577 | 0.541 | 0.504 | 0.468 | 0.432 | 0.396 | 0.36 | 0.324 | 0.288 | 0.252 | 0.216 | 0.18 | 0.144 | 0.108 | 0.072 | 0.036 |
| 0.8854166666666656 | 1.516 | 1.473 | 1.43 | 1.386 | 1.343 | 1.3 | 1.256 | 1.213 | 1.17 | 1.126 | 1.083 | 1.04 | 0.996 | 0.953 | 0.91 | 0.867 | 0.823 | 0.78 | 0.737 | 0.693 | 0.65 | 0.607 | 0.563 | 0.52 | 0.477 | 0.433 | 0.39 | 0.347 | 0.303 | 0.26 | 0.217 | 0.173 | 0.13 | 0.087 | 0.043 |
| 0.8958333333333323 | 1.666 | 1.619 | 1.571 | 1.524 | 1.476 | 1.428 | 1.381 | 1.333 | 1.285 | 1.238 | 1.19 | 1.143 | 1.095 | 1.047 | 1 | 0.952 | 0.905 | 0.857 | 0.809 | 0.762 | 0.714 | 0.667 | 0.619 | 0.571 | 0.524 | 0.476 | 0.428 | 0.381 | 0.333 | 0.286 | 0.238 | 0.19 | 0.143 | 0.095 | 0.048 |
| 0.9062499999999989 | 1.836 | 1.783 | 1.731 | 1.678 | 1.626 | 1.573 | 1.521 | 1.469 | 1.416 | 1.364 | 1.311 | 1.259 | 1.206 | 1.154 | 1.101 | 1.049 | 0.996 | 0.944 | 0.892 | 0.839 | 0.787 | 0.734 | 0.682 | 0.629 | 0.577 | 0.524 | 0.472 | 0.42 | 0.367 | 0.315 | 0.262 | 0.21 | 0.157 | 0.105 | 0.052 |
| 0.9166666666666655 | 1.992 | 1.935 | 1.878 | 1.821 | 1.764 | 1.707 | 1.65 | 1.593 | 1.537 | 1.48 | 1.423 | 1.366 | 1.309 | 1.252 | 1.195 | 1.138 | 1.081 | 1.024 | 0.967 | 0.911 | 0.854 | 0.797 | 0.74 | 0.683 | 0.626 | 0.569 | 0.512 | 0.455 | 0.398 | 0.341 | 0.285 | 0.228 | 0.171 | 0.114 | 0.057 |
| 0.9270833333333321 | 2.117 | 2.057 | 1.996 | 1.936 | 1.875 | 1.815 | 1.754 | 1.694 | 1.633 | 1.573 | 1.512 | 1.452 | 1.391 | 1.331 | 1.27 | 1.21 | 1.149 | 1.089 | 1.028 | 0.968 | 0.907 | 0.847 | 0.786 | 0.726 | 0.665 | 0.605 | 0.544 | 0.484 | 0.423 | 0.363 | 0.302 | 0.242 | 0.181 | 0.121 | 0.06 |
| 0.9374999999999988 | 2.221 | 2.157 | 2.094 | 2.03 | 1.967 | 1.903 | 1.84 | 1.777 | 1.713 | 1.65 | 1.586 | 1.523 | 1.459 | 1.396 | 1.332 | 1.269 | 1.206 | 1.142 | 1.079 | 1.015 | 0.952 | 0.888 | 0.825 | 0.761 | 0.698 | 0.634 | 0.571 | 0.508 | 0.444 | 0.381 | 0.317 | 0.254 | 0.19 | 0.127 | 0.063 |
| 0.9479166666666654 | 2.311 | 2.245 | 2.179 | 2.113 | 2.047 | 1.981 | 1.915 | 1.849 | 1.783 | 1.717 | 1.651 | 1.585 | 1.519 | 1.453 | 1.387 | 1.321 | 1.255 | 1.189 | 1.123 | 1.057 | 0.991 | 0.925 | 0.859 | 0.792 | 0.726 | 0.66 | 0.594 | 0.528 | 0.462 | 0.396 | 0.33 | 0.264 | 0.198 | 0.132 | 0.066 |
| 0.958333333333332 | 2.379 | 2.311 | 2.243 | 2.175 | 2.107 | 2.039 | 1.971 | 1.903 | 1.835 | 1.767 | 1.699 | 1.631 | 1.563 | 1.495 | 1.427 | 1.359 | 1.291 | 1.223 | 1.155 | 1.087 | 1.019 | 0.951 | 0.884 | 0.816 | 0.748 | 0.68 | 0.612 | 0.544 | 0.476 | 0.408 | 0.34 | 0.272 | 0.204 | 0.136 | 0.068 |
| 0.9687499999999987 | 2.432 | 2.363 | 2.293 | 2.224 | 2.154 | 2.085 | 2.015 | 1.946 | 1.876 | 1.807 | 1.737 | 1.668 | 1.598 | 1.529 | 1.459 | 1.39 | 1.32 | 1.251 | 1.181 | 1.112 | 1.042 | 0.973 | 0.903 | 0.834 | 0.764 | 0.695 | 0.625 | 0.556 | 0.486 | 0.417 | 0.347 | 0.278 | 0.208 | 0.139 | 0.069 |
| 0.9791666666666653 | 2.482 | 2.411 | 2.34 | 2.269 | 2.198 | 2.127 | 2.056 | 1.986 | 1.915 | 1.844 | 1.773 | 1.702 | 1.631 | 1.56 | 1.489 | 1.418 | 1.347 | 1.276 | 1.205 | 1.135 | 1.064 | 0.993 | 0.922 | 0.851 | 0.78 | 0.709 | 0.638 | 0.567 | 0.496 | 0.425 | 0.355 | 0.284 | 0.213 | 0.142 | 0.071 |
| 0.9895833333333319 | 2.568 | 2.495 | 2.421 | 2.348 | 2.275 | 2.201 | 2.128 | 2.054 | 1.981 | 1.908 | 1.834 | 1.761 | 1.688 | 1.614 | 1.541 | 1.467 | 1.394 | 1.321 | 1.247 | 1.174 | 1.101 | 1.027 | 0.954 | 0.88 | 0.807 | 0.734 | 0.66 | 0.587 | 0.514 | 0.44 | 0.367 | 0.293 | 0.22 | 0.147 | 0.073 |
| 0.9999999999999986 | 2.59 | 2.516 | 2.442 | 2.368 | 2.294 | 2.22 | 2.146 | 2.072 | 1.998 | 1.924 | 1.85 | 1.776 | 1.702 | 1.628 | 1.554 | 1.48 | 1.406 | 1.332 | 1.258 | 1.184 | 1.11 | 1.036 | 0.962 | 0.888 | 0.814 | 0.74 | 0.666 | 0.592 | 0.518 | 0.444 | 0.37 | 0.296 | 0.222 | 0.148 | 0.074 |